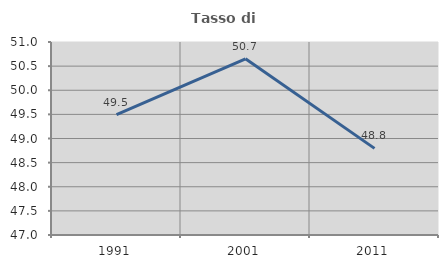
| Category | Tasso di occupazione   |
|---|---|
| 1991.0 | 49.496 |
| 2001.0 | 50.652 |
| 2011.0 | 48.795 |